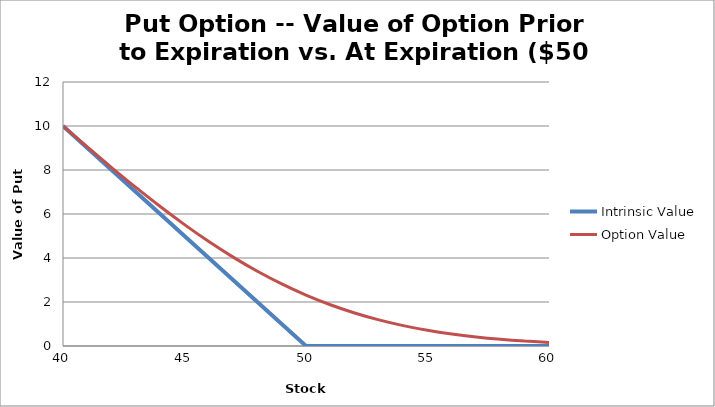
| Category | Intrinsic Value |
|---|---|
| 40.0 | 10 |
| 41.0 | 9 |
| 42.0 | 8 |
| 43.0 | 7 |
| 44.0 | 6 |
| 45.0 | 5 |
| 46.0 | 4 |
| 47.0 | 3 |
| 48.0 | 2 |
| 49.0 | 1 |
| 50.0 | 0 |
| 51.0 | 0 |
| 52.0 | 0 |
| 53.0 | 0 |
| 54.0 | 0 |
| 55.0 | 0 |
| 56.0 | 0 |
| 57.0 | 0 |
| 58.0 | 0 |
| 59.0 | 0 |
| 60.0 | 0 |